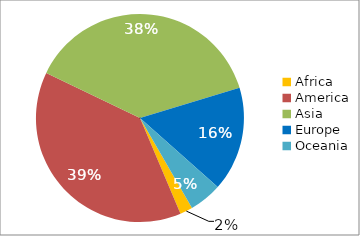
| Category | Series 0 |
|---|---|
| Africa | 37 |
| America | 725 |
| Asia | 719 |
| Europe | 306 |
| Oceania | 96 |